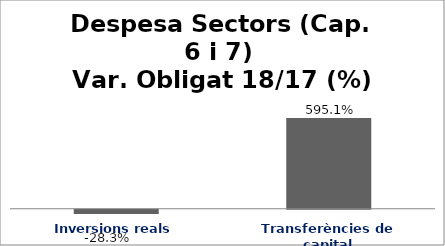
| Category | Series 0 |
|---|---|
| Inversions reals | -0.283 |
| Transferències de capital | 5.951 |